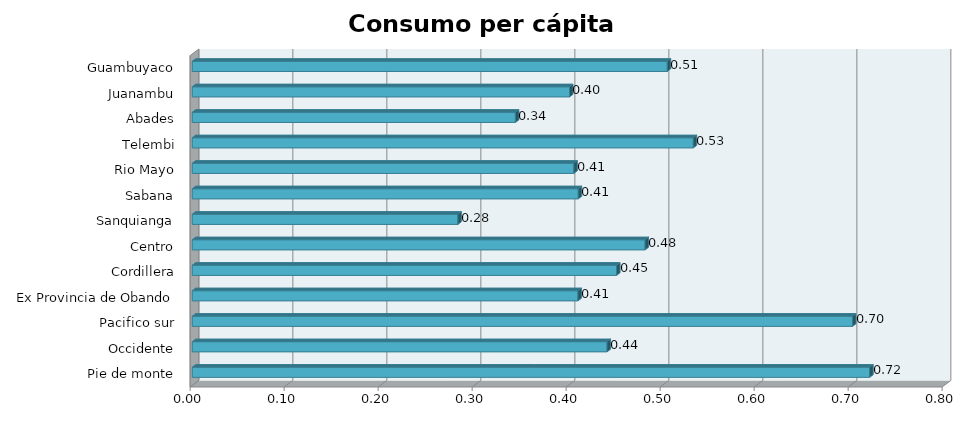
| Category | Series 0 |
|---|---|
| Pie de monte | 0.721 |
| Occidente | 0.441 |
| Pacifico sur | 0.702 |
| Ex Provincia de Obando | 0.41 |
| Cordillera | 0.451 |
| Centro | 0.482 |
| Sanquianga | 0.283 |
| Sabana | 0.411 |
| Rio Mayo | 0.406 |
| Telembi | 0.533 |
| Abades | 0.344 |
| Juanambu | 0.401 |
| Guambuyaco | 0.505 |